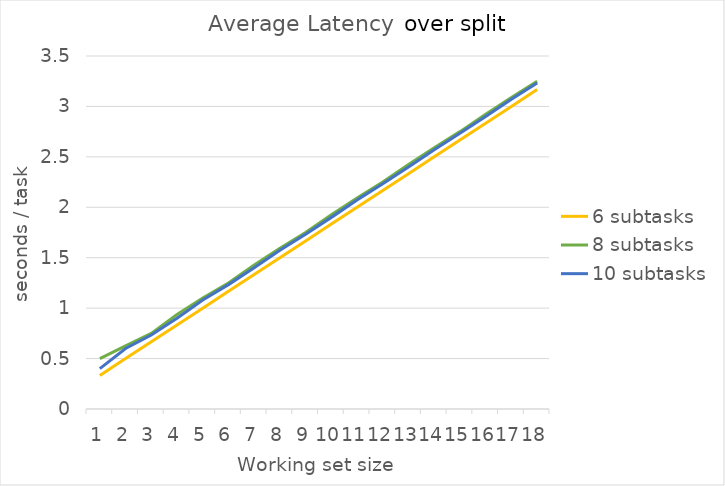
| Category | 6 subtasks | 8 subtasks | 10 subtasks |
|---|---|---|---|
| 0 | 0.333 | 0.5 | 0.4 |
| 1 | 0.5 | 0.625 | 0.6 |
| 2 | 0.667 | 0.75 | 0.733 |
| 3 | 0.833 | 0.938 | 0.9 |
| 4 | 1 | 1.1 | 1.08 |
| 5 | 1.167 | 1.25 | 1.233 |
| 6 | 1.333 | 1.429 | 1.4 |
| 7 | 1.5 | 1.594 | 1.575 |
| 8 | 1.667 | 1.75 | 1.733 |
| 9 | 1.833 | 1.925 | 1.9 |
| 10 | 2 | 2.091 | 2.073 |
| 11 | 2.167 | 2.25 | 2.233 |
| 12 | 2.333 | 2.423 | 2.4 |
| 13 | 2.5 | 2.589 | 2.571 |
| 14 | 2.667 | 2.75 | 2.733 |
| 15 | 2.833 | 2.922 | 2.9 |
| 16 | 3 | 3.088 | 3.071 |
| 17 | 3.167 | 3.25 | 3.233 |